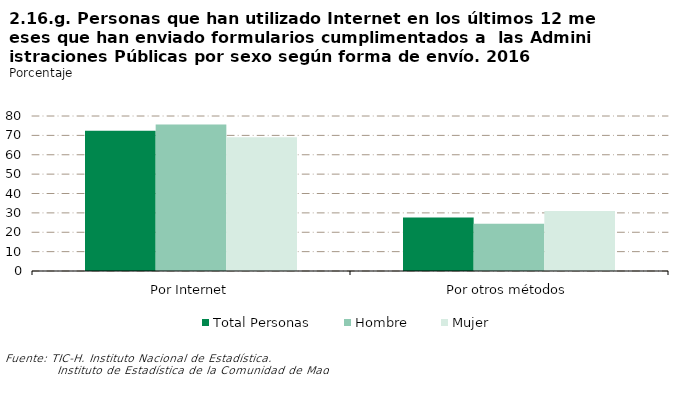
| Category | Total Personas | Hombre | Mujer |
|---|---|---|---|
| Por Internet | 72.407 | 75.588 | 69.095 |
| Por otros métodos | 27.593 | 24.412 | 30.905 |